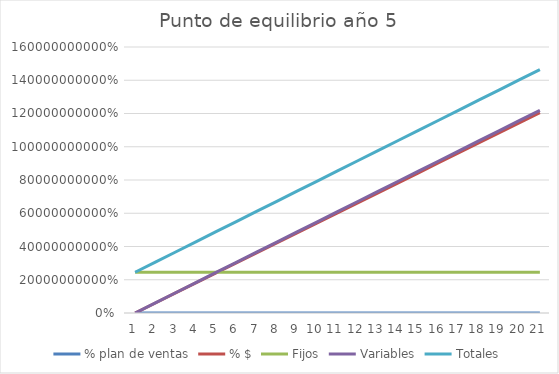
| Category | % plan de ventas | % $ | Fijos | Variables | Totales |
|---|---|---|---|---|---|
| 0 | 0 | 0 | 245144150.022 | 0 | 245144150.022 |
| 1 | 0.05 | 60243750 | 245144150.022 | 60959021.904 | 306103171.926 |
| 2 | 0.1 | 120487500 | 245144150.022 | 121918043.809 | 367062193.83 |
| 3 | 0.15 | 180731250 | 245144150.022 | 182877065.713 | 428021215.735 |
| 4 | 0.2 | 240975000 | 245144150.022 | 243836087.618 | 488980237.639 |
| 5 | 0.25 | 301218750 | 245144150.022 | 304795109.522 | 549939259.544 |
| 6 | 0.3 | 361462500 | 245144150.022 | 365754131.426 | 610898281.448 |
| 7 | 0.35 | 421706250 | 245144150.022 | 426713153.331 | 671857303.352 |
| 8 | 0.4 | 481950000 | 245144150.022 | 487672175.235 | 732816325.257 |
| 9 | 0.45 | 542193750 | 245144150.022 | 548631197.14 | 793775347.161 |
| 10 | 0.5 | 602437500 | 245144150.022 | 609590219.044 | 854734369.065 |
| 11 | 0.55 | 662681250 | 245144150.022 | 670549240.948 | 915693390.97 |
| 12 | 0.6 | 722925000 | 245144150.022 | 731508262.853 | 976652412.874 |
| 13 | 0.65 | 783168750 | 245144150.022 | 792467284.757 | 1037611434.779 |
| 14 | 0.7 | 843412500 | 245144150.022 | 853426306.662 | 1098570456.683 |
| 15 | 0.75 | 903656250 | 245144150.022 | 914385328.566 | 1159529478.587 |
| 16 | 0.8 | 963900000 | 245144150.022 | 975344350.47 | 1220488500.492 |
| 17 | 0.85 | 1024143750 | 245144150.022 | 1036303372.375 | 1281447522.396 |
| 18 | 0.9 | 1084387500 | 245144150.022 | 1097262394.279 | 1342406544.301 |
| 19 | 0.95 | 1144631250 | 245144150.022 | 1158221416.184 | 1403365566.205 |
| 20 | 1 | 1204875000 | 245144150.022 | 1219180438.088 | 1464324588.109 |